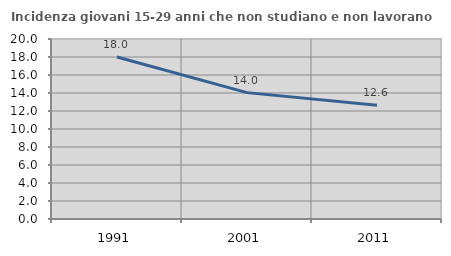
| Category | Incidenza giovani 15-29 anni che non studiano e non lavorano  |
|---|---|
| 1991.0 | 18.002 |
| 2001.0 | 14.041 |
| 2011.0 | 12.639 |